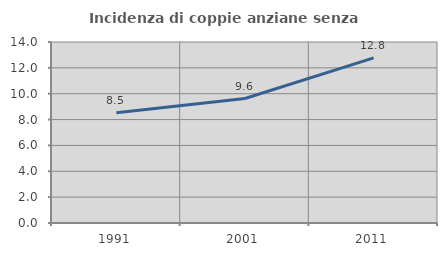
| Category | Incidenza di coppie anziane senza figli  |
|---|---|
| 1991.0 | 8.52 |
| 2001.0 | 9.63 |
| 2011.0 | 12.772 |